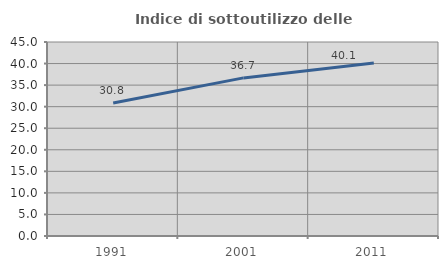
| Category | Indice di sottoutilizzo delle abitazioni  |
|---|---|
| 1991.0 | 30.839 |
| 2001.0 | 36.673 |
| 2011.0 | 40.137 |